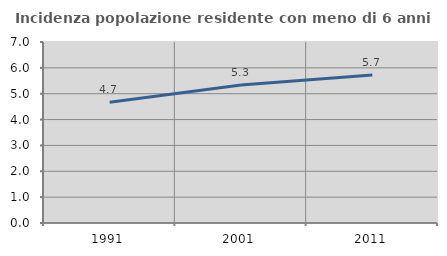
| Category | Incidenza popolazione residente con meno di 6 anni |
|---|---|
| 1991.0 | 4.672 |
| 2001.0 | 5.334 |
| 2011.0 | 5.72 |